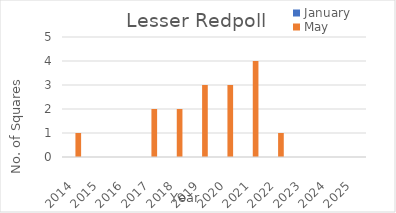
| Category | January | May |
|---|---|---|
| 2014.0 | 0 | 1 |
| 2015.0 | 0 | 0 |
| 2016.0 | 0 | 0 |
| 2017.0 | 0 | 2 |
| 2018.0 | 0 | 2 |
| 2019.0 | 0 | 3 |
| 2020.0 | 0 | 3 |
| 2021.0 | 0 | 4 |
| 2022.0 | 0 | 1 |
| 2023.0 | 0 | 0 |
| 2024.0 | 0 | 0 |
| 2025.0 | 0 | 0 |